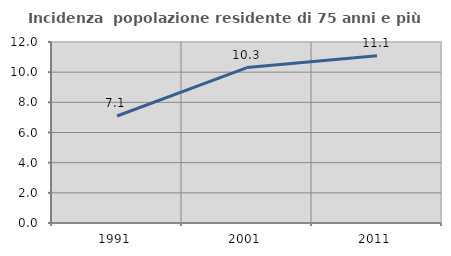
| Category | Incidenza  popolazione residente di 75 anni e più |
|---|---|
| 1991.0 | 7.094 |
| 2001.0 | 10.304 |
| 2011.0 | 11.086 |